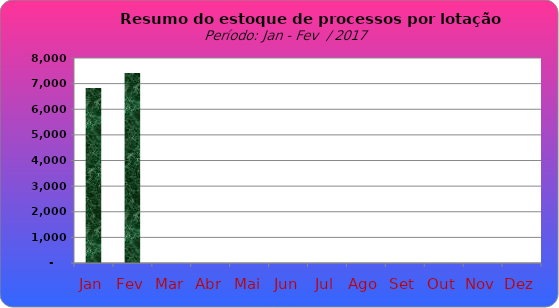
| Category | Series 0 |
|---|---|
| Jan | 6829 |
| Fev | 7414 |
| Mar | 0 |
| Abr | 0 |
| Mai | 0 |
| Jun | 0 |
| Jul | 0 |
| Ago | 0 |
| Set | 0 |
| Out | 0 |
| Nov | 0 |
| Dez | 0 |